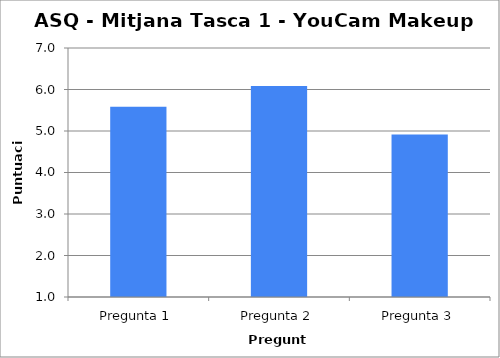
| Category | Series 0 |
|---|---|
| Pregunta 1 | 5.583 |
| Pregunta 2 | 6.083 |
| Pregunta 3 | 4.917 |